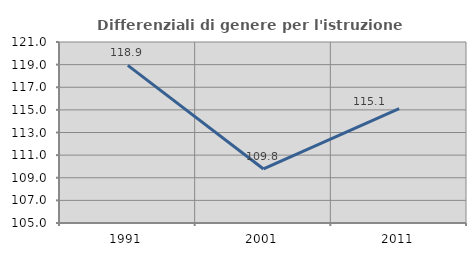
| Category | Differenziali di genere per l'istruzione superiore |
|---|---|
| 1991.0 | 118.937 |
| 2001.0 | 109.776 |
| 2011.0 | 115.105 |